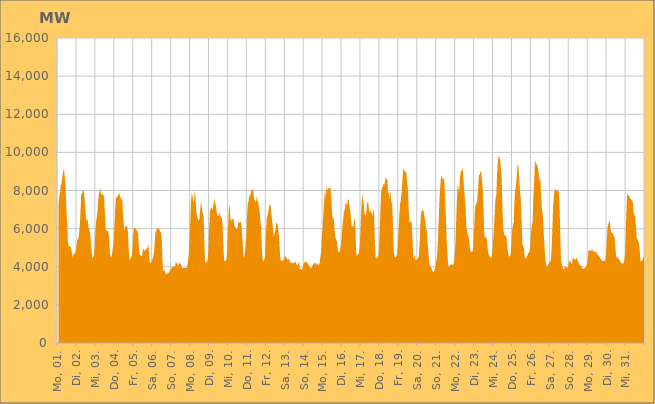
| Category | Series 0 |
|---|---|
|  Mo, 01.  | 7129.859 |
|  Mo, 01.  | 7673.893 |
|  Mo, 01.  | 7833.704 |
|  Mo, 01.  | 8298.259 |
|  Mo, 01.  | 8360.999 |
|  Mo, 01.  | 8725.097 |
|  Mo, 01.  | 8967.838 |
|  Mo, 01.  | 9195.239 |
|  Mo, 01.  | 8722.583 |
|  Mo, 01.  | 8317.963 |
|  Mo, 01.  | 7188.776 |
|  Mo, 01.  | 6366.723 |
|  Mo, 01.  | 5282.318 |
|  Mo, 01.  | 5061.183 |
|  Mo, 01.  | 5069.511 |
|  Mo, 01.  | 5073.156 |
|  Mo, 01.  | 5020.052 |
|  Di, 02.  | 4747.451 |
|  Di, 02.  | 4475.486 |
|  Di, 02.  | 4675.184 |
|  Di, 02.  | 4653.983 |
|  Di, 02.  | 4721.074 |
|  Di, 02.  | 4769.617 |
|  Di, 02.  | 5137.401 |
|  Di, 02.  | 5391.889 |
|  Di, 02.  | 5462.678 |
|  Di, 02.  | 5621.96 |
|  Di, 02.  | 6124.444 |
|  Di, 02.  | 6890.183 |
|  Di, 02.  | 7850.321 |
|  Di, 02.  | 7835.134 |
|  Di, 02.  | 8016.397 |
|  Di, 02.  | 8018.556 |
|  Di, 02.  | 7696.417 |
|  Di, 02.  | 7128.472 |
|  Di, 02.  | 6435.958 |
|  Di, 02.  | 6431.473 |
|  Di, 02.  | 6521.108 |
|  Di, 02.  | 6089.295 |
|  Di, 02.  | 5990.244 |
|  Di, 02.  | 5822.376 |
|  Mi, 03.  | 5435.616 |
|  Mi, 03.  | 4841.119 |
|  Mi, 03.  | 4442.42 |
|  Mi, 03.  | 4523.028 |
|  Mi, 03.  | 4606.582 |
|  Mi, 03.  | 5091.001 |
|  Mi, 03.  | 5968.404 |
|  Mi, 03.  | 6423.607 |
|  Mi, 03.  | 6665.031 |
|  Mi, 03.  | 7119.114 |
|  Mi, 03.  | 7755.533 |
|  Mi, 03.  | 7915.189 |
|  Mi, 03.  | 8147.496 |
|  Mi, 03.  | 7823.214 |
|  Mi, 03.  | 7803.474 |
|  Mi, 03.  | 7806.908 |
|  Mi, 03.  | 7762.133 |
|  Mi, 03.  | 7637.401 |
|  Mi, 03.  | 6734.404 |
|  Mi, 03.  | 5899.255 |
|  Mi, 03.  | 5931.852 |
|  Mi, 03.  | 5849.619 |
|  Mi, 03.  | 5880.683 |
|  Mi, 03.  | 5604.901 |
|  Do, 04.  | 4901.651 |
|  Do, 04.  | 4512.685 |
|  Do, 04.  | 4488.421 |
|  Do, 04.  | 4671.668 |
|  Do, 04.  | 5011.251 |
|  Do, 04.  | 5264.755 |
|  Do, 04.  | 6144.135 |
|  Do, 04.  | 7064.495 |
|  Do, 04.  | 7563.288 |
|  Do, 04.  | 7730.391 |
|  Do, 04.  | 7671.09 |
|  Do, 04.  | 7764.818 |
|  Do, 04.  | 7885.352 |
|  Do, 04.  | 7723.649 |
|  Do, 04.  | 7617.039 |
|  Do, 04.  | 7529.346 |
|  Do, 04.  | 7541.914 |
|  Do, 04.  | 6617.253 |
|  Do, 04.  | 6159.324 |
|  Do, 04.  | 5902.806 |
|  Do, 04.  | 6152.809 |
|  Do, 04.  | 6117.432 |
|  Do, 04.  | 6142.779 |
|  Do, 04.  | 5908.645 |
|  Fr, 05.  | 4958.976 |
|  Fr, 05.  | 4332.08 |
|  Fr, 05.  | 4437.479 |
|  Fr, 05.  | 4452.83 |
|  Fr, 05.  | 4546.803 |
|  Fr, 05.  | 4986.752 |
|  Fr, 05.  | 5748.55 |
|  Fr, 05.  | 6075.568 |
|  Fr, 05.  | 6029.269 |
|  Fr, 05.  | 5981.073 |
|  Fr, 05.  | 5923.186 |
|  Fr, 05.  | 5877.169 |
|  Fr, 05.  | 5766.122 |
|  Fr, 05.  | 5063.674 |
|  Fr, 05.  | 4641.886 |
|  Fr, 05.  | 4590.303 |
|  Fr, 05.  | 4580.817 |
|  Fr, 05.  | 4535.13 |
|  Fr, 05.  | 4870.529 |
|  Fr, 05.  | 4923.622 |
|  Fr, 05.  | 4839.329 |
|  Fr, 05.  | 4844.424 |
|  Fr, 05.  | 4943.589 |
|  Fr, 05.  | 4955.963 |
|  Sa, 06.  | 5003.752 |
|  Sa, 06.  | 5216.602 |
|  Sa, 06.  | 4563.734 |
|  Sa, 06.  | 4200.241 |
|  Sa, 06.  | 4199.412 |
|  Sa, 06.  | 4268.582 |
|  Sa, 06.  | 4367.124 |
|  Sa, 06.  | 4455.75 |
|  Sa, 06.  | 4719.183 |
|  Sa, 06.  | 5167.216 |
|  Sa, 06.  | 5841.41 |
|  Sa, 06.  | 5861.715 |
|  Sa, 06.  | 6106.127 |
|  Sa, 06.  | 5982.405 |
|  Sa, 06.  | 5986.613 |
|  Sa, 06.  | 5950.838 |
|  Sa, 06.  | 5844.445 |
|  Sa, 06.  | 5794.309 |
|  Sa, 06.  | 5493.372 |
|  Sa, 06.  | 4176.971 |
|  Sa, 06.  | 3792.708 |
|  Sa, 06.  | 3808.328 |
|  Sa, 06.  | 3789.137 |
|  Sa, 06.  | 3596.004 |
|  So, 07.  | 3629.062 |
|  So, 07.  | 3640.954 |
|  So, 07.  | 3640.486 |
|  So, 07.  | 3697.788 |
|  So, 07.  | 3803.666 |
|  So, 07.  | 3858.389 |
|  So, 07.  | 3915.168 |
|  So, 07.  | 3962.246 |
|  So, 07.  | 4045.248 |
|  So, 07.  | 3993.991 |
|  So, 07.  | 3987.216 |
|  So, 07.  | 4065.187 |
|  So, 07.  | 4298.033 |
|  So, 07.  | 4164.309 |
|  So, 07.  | 4111.659 |
|  So, 07.  | 4075.323 |
|  So, 07.  | 4203.741 |
|  So, 07.  | 4173.319 |
|  So, 07.  | 4147.988 |
|  So, 07.  | 4018.808 |
|  So, 07.  | 3878.802 |
|  So, 07.  | 3948.895 |
|  So, 07.  | 3943.95 |
|  So, 07.  | 3950.971 |
|  Mo, 08.  | 3946.447 |
|  Mo, 08.  | 3924.24 |
|  Mo, 08.  | 3973.484 |
|  Mo, 08.  | 4163.533 |
|  Mo, 08.  | 4590.058 |
|  Mo, 08.  | 5281.156 |
|  Mo, 08.  | 6276.805 |
|  Mo, 08.  | 7396.469 |
|  Mo, 08.  | 7879.272 |
|  Mo, 08.  | 7730.195 |
|  Mo, 08.  | 7345.812 |
|  Mo, 08.  | 7522.116 |
|  Mo, 08.  | 8073.334 |
|  Mo, 08.  | 7447.185 |
|  Mo, 08.  | 6851.257 |
|  Mo, 08.  | 6645.569 |
|  Mo, 08.  | 6460.086 |
|  Mo, 08.  | 6404.871 |
|  Mo, 08.  | 6544.951 |
|  Mo, 08.  | 7137.67 |
|  Mo, 08.  | 7431.13 |
|  Mo, 08.  | 7018.088 |
|  Mo, 08.  | 6808.462 |
|  Mo, 08.  | 6710.28 |
|  Di, 09.  | 5280.215 |
|  Di, 09.  | 4246.904 |
|  Di, 09.  | 4187.077 |
|  Di, 09.  | 4262.985 |
|  Di, 09.  | 4331.89 |
|  Di, 09.  | 4714.729 |
|  Di, 09.  | 5976.716 |
|  Di, 09.  | 6839.212 |
|  Di, 09.  | 7095.926 |
|  Di, 09.  | 7130.488 |
|  Di, 09.  | 6956.006 |
|  Di, 09.  | 7081.242 |
|  Di, 09.  | 7366.693 |
|  Di, 09.  | 7565.569 |
|  Di, 09.  | 7308.467 |
|  Di, 09.  | 7113.487 |
|  Di, 09.  | 6722.251 |
|  Di, 09.  | 6650.172 |
|  Di, 09.  | 6681.766 |
|  Di, 09.  | 6884.863 |
|  Di, 09.  | 6679.137 |
|  Di, 09.  | 6630.877 |
|  Di, 09.  | 6552.338 |
|  Di, 09.  | 6324.83 |
|  Mi, 10.  | 5182.661 |
|  Mi, 10.  | 4289.572 |
|  Mi, 10.  | 4323.026 |
|  Mi, 10.  | 4317.582 |
|  Mi, 10.  | 4383.706 |
|  Mi, 10.  | 4861.521 |
|  Mi, 10.  | 5951.18 |
|  Mi, 10.  | 7008.456 |
|  Mi, 10.  | 7282.687 |
|  Mi, 10.  | 6602.607 |
|  Mi, 10.  | 6356.122 |
|  Mi, 10.  | 6551.456 |
|  Mi, 10.  | 6454.648 |
|  Mi, 10.  | 6556.919 |
|  Mi, 10.  | 6157.372 |
|  Mi, 10.  | 6114.554 |
|  Mi, 10.  | 6008.775 |
|  Mi, 10.  | 5965.38 |
|  Mi, 10.  | 6006.803 |
|  Mi, 10.  | 6375.733 |
|  Mi, 10.  | 6288.363 |
|  Mi, 10.  | 6331.566 |
|  Mi, 10.  | 6375.968 |
|  Mi, 10.  | 6207.477 |
|  Do, 11.  | 5648.035 |
|  Do, 11.  | 4908.973 |
|  Do, 11.  | 4456.346 |
|  Do, 11.  | 4585.918 |
|  Do, 11.  | 4953.858 |
|  Do, 11.  | 5536.617 |
|  Do, 11.  | 6519.271 |
|  Do, 11.  | 7296.72 |
|  Do, 11.  | 7419.262 |
|  Do, 11.  | 7745.882 |
|  Do, 11.  | 7681.393 |
|  Do, 11.  | 7881.572 |
|  Do, 11.  | 8086.982 |
|  Do, 11.  | 8030.722 |
|  Do, 11.  | 7990.501 |
|  Do, 11.  | 7528.296 |
|  Do, 11.  | 7522.459 |
|  Do, 11.  | 7365.334 |
|  Do, 11.  | 7694.736 |
|  Do, 11.  | 7407.469 |
|  Do, 11.  | 7489.8 |
|  Do, 11.  | 7129.364 |
|  Do, 11.  | 6940.818 |
|  Do, 11.  | 6422.873 |
|  Fr, 12.  | 6068.648 |
|  Fr, 12.  | 4899.062 |
|  Fr, 12.  | 4338.321 |
|  Fr, 12.  | 4322.843 |
|  Fr, 12.  | 4364.444 |
|  Fr, 12.  | 4572.93 |
|  Fr, 12.  | 5697.948 |
|  Fr, 12.  | 6529.31 |
|  Fr, 12.  | 6669.81 |
|  Fr, 12.  | 6827.672 |
|  Fr, 12.  | 7167.786 |
|  Fr, 12.  | 7288.991 |
|  Fr, 12.  | 7189.006 |
|  Fr, 12.  | 6745.478 |
|  Fr, 12.  | 6386.367 |
|  Fr, 12.  | 6012.074 |
|  Fr, 12.  | 5536.491 |
|  Fr, 12.  | 5754.969 |
|  Fr, 12.  | 5910.291 |
|  Fr, 12.  | 6290.893 |
|  Fr, 12.  | 6300.267 |
|  Fr, 12.  | 6182.37 |
|  Fr, 12.  | 5791.17 |
|  Fr, 12.  | 5364.606 |
|  Sa, 13.  | 4555.378 |
|  Sa, 13.  | 4305.204 |
|  Sa, 13.  | 4318.956 |
|  Sa, 13.  | 4329.96 |
|  Sa, 13.  | 4329.789 |
|  Sa, 13.  | 4378.257 |
|  Sa, 13.  | 4569.841 |
|  Sa, 13.  | 4532.606 |
|  Sa, 13.  | 4490.705 |
|  Sa, 13.  | 4338.298 |
|  Sa, 13.  | 4458.808 |
|  Sa, 13.  | 4387.522 |
|  Sa, 13.  | 4298.724 |
|  Sa, 13.  | 4233.941 |
|  Sa, 13.  | 4197.519 |
|  Sa, 13.  | 4197.183 |
|  Sa, 13.  | 4183.812 |
|  Sa, 13.  | 4214.319 |
|  Sa, 13.  | 4199.511 |
|  Sa, 13.  | 4292.816 |
|  Sa, 13.  | 4221.863 |
|  Sa, 13.  | 4132.91 |
|  Sa, 13.  | 4043.977 |
|  Sa, 13.  | 4175.385 |
|  So, 14.  | 4290.427 |
|  So, 14.  | 3881.658 |
|  So, 14.  | 3886.219 |
|  So, 14.  | 3837.966 |
|  So, 14.  | 3853.707 |
|  So, 14.  | 3998.18 |
|  So, 14.  | 4156.772 |
|  So, 14.  | 4240.385 |
|  So, 14.  | 4235.684 |
|  So, 14.  | 4275.376 |
|  So, 14.  | 4254.298 |
|  So, 14.  | 4172.064 |
|  So, 14.  | 4106.668 |
|  So, 14.  | 4001.06 |
|  So, 14.  | 3971.407 |
|  So, 14.  | 3932.226 |
|  So, 14.  | 3931.159 |
|  So, 14.  | 4062.342 |
|  So, 14.  | 4123.111 |
|  So, 14.  | 4159.424 |
|  So, 14.  | 4231.859 |
|  So, 14.  | 4176.742 |
|  So, 14.  | 4109.52 |
|  So, 14.  | 4147.578 |
|  Mo, 15.  | 4184.71 |
|  Mo, 15.  | 4053.094 |
|  Mo, 15.  | 4181.281 |
|  Mo, 15.  | 4477.494 |
|  Mo, 15.  | 4794.329 |
|  Mo, 15.  | 5643.758 |
|  Mo, 15.  | 6164.831 |
|  Mo, 15.  | 6913.736 |
|  Mo, 15.  | 7539.584 |
|  Mo, 15.  | 8070.252 |
|  Mo, 15.  | 7613.511 |
|  Mo, 15.  | 8269.427 |
|  Mo, 15.  | 8011.049 |
|  Mo, 15.  | 8075.093 |
|  Mo, 15.  | 8167.069 |
|  Mo, 15.  | 8159.522 |
|  Mo, 15.  | 8102.785 |
|  Mo, 15.  | 7530.398 |
|  Mo, 15.  | 6782.451 |
|  Mo, 15.  | 6396.16 |
|  Mo, 15.  | 6664.799 |
|  Mo, 15.  | 5929.594 |
|  Mo, 15.  | 5562.304 |
|  Mo, 15.  | 5399.29 |
|  Di, 16.  | 5330.983 |
|  Di, 16.  | 4917.608 |
|  Di, 16.  | 4761.432 |
|  Di, 16.  | 4766.254 |
|  Di, 16.  | 4844.228 |
|  Di, 16.  | 5120.514 |
|  Di, 16.  | 5539.803 |
|  Di, 16.  | 6145.974 |
|  Di, 16.  | 6477.727 |
|  Di, 16.  | 6991.461 |
|  Di, 16.  | 6911.555 |
|  Di, 16.  | 7406.553 |
|  Di, 16.  | 7271.311 |
|  Di, 16.  | 7242.772 |
|  Di, 16.  | 7548.785 |
|  Di, 16.  | 7514.477 |
|  Di, 16.  | 7106.611 |
|  Di, 16.  | 6956.564 |
|  Di, 16.  | 6431.821 |
|  Di, 16.  | 6096.575 |
|  Di, 16.  | 6114.113 |
|  Di, 16.  | 6105.199 |
|  Di, 16.  | 6513.672 |
|  Di, 16.  | 6450.398 |
|  Mi, 17.  | 5180.715 |
|  Mi, 17.  | 4568.967 |
|  Mi, 17.  | 4618.597 |
|  Mi, 17.  | 4674.194 |
|  Mi, 17.  | 4761.251 |
|  Mi, 17.  | 5080.373 |
|  Mi, 17.  | 6019.652 |
|  Mi, 17.  | 7050.354 |
|  Mi, 17.  | 7823.298 |
|  Mi, 17.  | 7492.625 |
|  Mi, 17.  | 7303.765 |
|  Mi, 17.  | 6827.36 |
|  Mi, 17.  | 6624.056 |
|  Mi, 17.  | 6775.874 |
|  Mi, 17.  | 7226.342 |
|  Mi, 17.  | 7450.054 |
|  Mi, 17.  | 7313.738 |
|  Mi, 17.  | 6844.711 |
|  Mi, 17.  | 6874.217 |
|  Mi, 17.  | 7007.441 |
|  Mi, 17.  | 6788.431 |
|  Mi, 17.  | 6690.637 |
|  Mi, 17.  | 7017.383 |
|  Mi, 17.  | 6789.205 |
|  Do, 18.  | 5532.465 |
|  Do, 18.  | 4485.283 |
|  Do, 18.  | 4469.037 |
|  Do, 18.  | 4432.187 |
|  Do, 18.  | 4510.328 |
|  Do, 18.  | 4726.377 |
|  Do, 18.  | 5617.906 |
|  Do, 18.  | 6750.4 |
|  Do, 18.  | 7900.518 |
|  Do, 18.  | 8090.323 |
|  Do, 18.  | 8204.544 |
|  Do, 18.  | 8339.257 |
|  Do, 18.  | 8269.971 |
|  Do, 18.  | 8474.98 |
|  Do, 18.  | 8688.272 |
|  Do, 18.  | 8589.065 |
|  Do, 18.  | 8547.169 |
|  Do, 18.  | 7747.15 |
|  Do, 18.  | 7957.184 |
|  Do, 18.  | 7497.121 |
|  Do, 18.  | 7990.091 |
|  Do, 18.  | 7404.125 |
|  Do, 18.  | 7267.54 |
|  Do, 18.  | 6315.318 |
|  Fr, 19.  | 4837.268 |
|  Fr, 19.  | 4530.626 |
|  Fr, 19.  | 4478.017 |
|  Fr, 19.  | 4510.511 |
|  Fr, 19.  | 4619.046 |
|  Fr, 19.  | 4927.846 |
|  Fr, 19.  | 5830.974 |
|  Fr, 19.  | 6590.092 |
|  Fr, 19.  | 7247.852 |
|  Fr, 19.  | 7505.265 |
|  Fr, 19.  | 7894.741 |
|  Fr, 19.  | 8508.788 |
|  Fr, 19.  | 9059.927 |
|  Fr, 19.  | 9149.289 |
|  Fr, 19.  | 8994.032 |
|  Fr, 19.  | 8981.07 |
|  Fr, 19.  | 8941.727 |
|  Fr, 19.  | 8435.963 |
|  Fr, 19.  | 8033.63 |
|  Fr, 19.  | 7047.817 |
|  Fr, 19.  | 6277.683 |
|  Fr, 19.  | 6345.141 |
|  Fr, 19.  | 6450.015 |
|  Fr, 19.  | 6118.051 |
|  Sa, 20.  | 5260.563 |
|  Sa, 20.  | 4367.314 |
|  Sa, 20.  | 4646.041 |
|  Sa, 20.  | 4432.068 |
|  Sa, 20.  | 4339.76 |
|  Sa, 20.  | 4355.578 |
|  Sa, 20.  | 4430.166 |
|  Sa, 20.  | 4438.147 |
|  Sa, 20.  | 4602.175 |
|  Sa, 20.  | 5421.236 |
|  Sa, 20.  | 6467.972 |
|  Sa, 20.  | 6845.012 |
|  Sa, 20.  | 7009.941 |
|  Sa, 20.  | 6943.42 |
|  Sa, 20.  | 6908.564 |
|  Sa, 20.  | 6638.964 |
|  Sa, 20.  | 6410.491 |
|  Sa, 20.  | 5956.137 |
|  Sa, 20.  | 5938.966 |
|  Sa, 20.  | 5244.27 |
|  Sa, 20.  | 4735.816 |
|  Sa, 20.  | 4164.591 |
|  Sa, 20.  | 4050.603 |
|  Sa, 20.  | 3999.927 |
|  So, 21.  | 3911.274 |
|  So, 21.  | 3777.191 |
|  So, 21.  | 3715.82 |
|  So, 21.  | 3759.277 |
|  So, 21.  | 3846.447 |
|  So, 21.  | 4023.705 |
|  So, 21.  | 4312.669 |
|  So, 21.  | 4551.292 |
|  So, 21.  | 5314.99 |
|  So, 21.  | 6394.38 |
|  So, 21.  | 7507.408 |
|  So, 21.  | 8208.675 |
|  So, 21.  | 8793.341 |
|  So, 21.  | 8673.873 |
|  So, 21.  | 8614.735 |
|  So, 21.  | 8624.143 |
|  So, 21.  | 8590.152 |
|  So, 21.  | 7727.151 |
|  So, 21.  | 6847.132 |
|  So, 21.  | 5467.268 |
|  So, 21.  | 4743.039 |
|  So, 21.  | 4106.784 |
|  So, 21.  | 3986.707 |
|  So, 21.  | 4088.685 |
|  Mo, 22.  | 4107.556 |
|  Mo, 22.  | 4104.205 |
|  Mo, 22.  | 4157.611 |
|  Mo, 22.  | 4046.263 |
|  Mo, 22.  | 4180.202 |
|  Mo, 22.  | 4443.161 |
|  Mo, 22.  | 4992.941 |
|  Mo, 22.  | 6184.888 |
|  Mo, 22.  | 7402.284 |
|  Mo, 22.  | 8283.09 |
|  Mo, 22.  | 8185.723 |
|  Mo, 22.  | 7899.377 |
|  Mo, 22.  | 8661.894 |
|  Mo, 22.  | 9011.321 |
|  Mo, 22.  | 9039.542 |
|  Mo, 22.  | 9232.49 |
|  Mo, 22.  | 8813.412 |
|  Mo, 22.  | 8222.86 |
|  Mo, 22.  | 7678.621 |
|  Mo, 22.  | 7245.686 |
|  Mo, 22.  | 6152.494 |
|  Mo, 22.  | 5842.06 |
|  Mo, 22.  | 5643.136 |
|  Mo, 22.  | 5590.532 |
|  Di, 23.  | 5221.845 |
|  Di, 23.  | 4828.016 |
|  Di, 23.  | 4787.561 |
|  Di, 23.  | 4784.3 |
|  Di, 23.  | 4790.115 |
|  Di, 23.  | 5174.118 |
|  Di, 23.  | 6029.592 |
|  Di, 23.  | 7007.817 |
|  Di, 23.  | 7267.464 |
|  Di, 23.  | 7290.211 |
|  Di, 23.  | 7556.441 |
|  Di, 23.  | 8095.534 |
|  Di, 23.  | 8833.484 |
|  Di, 23.  | 8815.136 |
|  Di, 23.  | 9046.824 |
|  Di, 23.  | 8884.368 |
|  Di, 23.  | 8504.594 |
|  Di, 23.  | 7998.576 |
|  Di, 23.  | 6739.388 |
|  Di, 23.  | 5550.593 |
|  Di, 23.  | 5561.572 |
|  Di, 23.  | 5581.064 |
|  Di, 23.  | 5457.271 |
|  Di, 23.  | 5024.925 |
|  Mi, 24.  | 4671.698 |
|  Mi, 24.  | 4605.125 |
|  Mi, 24.  | 4520.823 |
|  Mi, 24.  | 4465.137 |
|  Mi, 24.  | 4479.631 |
|  Mi, 24.  | 4872.426 |
|  Mi, 24.  | 5422.95 |
|  Mi, 24.  | 6033.25 |
|  Mi, 24.  | 6824.501 |
|  Mi, 24.  | 7622.671 |
|  Mi, 24.  | 7661.779 |
|  Mi, 24.  | 8875.248 |
|  Mi, 24.  | 9454.291 |
|  Mi, 24.  | 9855.169 |
|  Mi, 24.  | 9738.13 |
|  Mi, 24.  | 9543.099 |
|  Mi, 24.  | 9103.041 |
|  Mi, 24.  | 8476.251 |
|  Mi, 24.  | 6895.192 |
|  Mi, 24.  | 5936.913 |
|  Mi, 24.  | 5685.621 |
|  Mi, 24.  | 5628.936 |
|  Mi, 24.  | 5633.28 |
|  Mi, 24.  | 5544.543 |
|  Do, 25.  | 5031.402 |
|  Do, 25.  | 4708.861 |
|  Do, 25.  | 4526.279 |
|  Do, 25.  | 4546.797 |
|  Do, 25.  | 4598.549 |
|  Do, 25.  | 4975.108 |
|  Do, 25.  | 5894.044 |
|  Do, 25.  | 6174.241 |
|  Do, 25.  | 6324.294 |
|  Do, 25.  | 7372.535 |
|  Do, 25.  | 8039.078 |
|  Do, 25.  | 8220.225 |
|  Do, 25.  | 8751.374 |
|  Do, 25.  | 9401.187 |
|  Do, 25.  | 9313.841 |
|  Do, 25.  | 8716.872 |
|  Do, 25.  | 7981.331 |
|  Do, 25.  | 7617.573 |
|  Do, 25.  | 6596.939 |
|  Do, 25.  | 5237.195 |
|  Do, 25.  | 5063.129 |
|  Do, 25.  | 4954.54 |
|  Do, 25.  | 4531.777 |
|  Do, 25.  | 4437.878 |
|  Fr, 26.  | 4452.013 |
|  Fr, 26.  | 4550.029 |
|  Fr, 26.  | 4641.462 |
|  Fr, 26.  | 4734.715 |
|  Fr, 26.  | 4772.9 |
|  Fr, 26.  | 5014.357 |
|  Fr, 26.  | 5805.201 |
|  Fr, 26.  | 6164.145 |
|  Fr, 26.  | 6321.612 |
|  Fr, 26.  | 7580.563 |
|  Fr, 26.  | 8475.6 |
|  Fr, 26.  | 9426.73 |
|  Fr, 26.  | 9548.028 |
|  Fr, 26.  | 9376.804 |
|  Fr, 26.  | 9319.047 |
|  Fr, 26.  | 9133.164 |
|  Fr, 26.  | 8781.505 |
|  Fr, 26.  | 8514.614 |
|  Fr, 26.  | 8588.798 |
|  Fr, 26.  | 7576.367 |
|  Fr, 26.  | 6943.783 |
|  Fr, 26.  | 6745.97 |
|  Fr, 26.  | 5910.821 |
|  Fr, 26.  | 5156.054 |
|  Sa, 27.  | 4528.24 |
|  Sa, 27.  | 4117.867 |
|  Sa, 27.  | 3997.448 |
|  Sa, 27.  | 4044.693 |
|  Sa, 27.  | 4118.652 |
|  Sa, 27.  | 4208.179 |
|  Sa, 27.  | 4297.669 |
|  Sa, 27.  | 4254.669 |
|  Sa, 27.  | 4872.513 |
|  Sa, 27.  | 5872.605 |
|  Sa, 27.  | 7141.687 |
|  Sa, 27.  | 7676.188 |
|  Sa, 27.  | 8114.11 |
|  Sa, 27.  | 8020.84 |
|  Sa, 27.  | 8010.269 |
|  Sa, 27.  | 7975.617 |
|  Sa, 27.  | 7966.594 |
|  Sa, 27.  | 7977.798 |
|  Sa, 27.  | 7417.965 |
|  Sa, 27.  | 5980.498 |
|  Sa, 27.  | 4364.856 |
|  Sa, 27.  | 4133.305 |
|  Sa, 27.  | 4018.43 |
|  Sa, 27.  | 3891.33 |
|  So, 28.  | 3882.783 |
|  So, 28.  | 4003.327 |
|  So, 28.  | 4016.601 |
|  So, 28.  | 3963.967 |
|  So, 28.  | 3918.558 |
|  So, 28.  | 3999.072 |
|  So, 28.  | 4224.106 |
|  So, 28.  | 4309.441 |
|  So, 28.  | 4268.963 |
|  So, 28.  | 4175.081 |
|  So, 28.  | 4150.949 |
|  So, 28.  | 4497.099 |
|  So, 28.  | 4432.31 |
|  So, 28.  | 4385.002 |
|  So, 28.  | 4352.948 |
|  So, 28.  | 4429.938 |
|  So, 28.  | 4464.166 |
|  So, 28.  | 4325.843 |
|  So, 28.  | 4236.627 |
|  So, 28.  | 4141.69 |
|  So, 28.  | 4070.238 |
|  So, 28.  | 4084.762 |
|  So, 28.  | 4015.759 |
|  So, 28.  | 3917.939 |
|  Mo, 29.  | 3877.358 |
|  Mo, 29.  | 3910.33 |
|  Mo, 29.  | 3934.733 |
|  Mo, 29.  | 3945.965 |
|  Mo, 29.  | 4022.932 |
|  Mo, 29.  | 4176.095 |
|  Mo, 29.  | 4485.606 |
|  Mo, 29.  | 4882.459 |
|  Mo, 29.  | 4900.068 |
|  Mo, 29.  | 4815.381 |
|  Mo, 29.  | 4824.276 |
|  Mo, 29.  | 4903.486 |
|  Mo, 29.  | 4892.24 |
|  Mo, 29.  | 4778.665 |
|  Mo, 29.  | 4827.338 |
|  Mo, 29.  | 4788.925 |
|  Mo, 29.  | 4750.84 |
|  Mo, 29.  | 4757.592 |
|  Mo, 29.  | 4651.768 |
|  Mo, 29.  | 4621.986 |
|  Mo, 29.  | 4558.819 |
|  Mo, 29.  | 4507.243 |
|  Mo, 29.  | 4429.481 |
|  Mo, 29.  | 4376.149 |
|  Di, 30.  | 4310.066 |
|  Di, 30.  | 4294.857 |
|  Di, 30.  | 4303.44 |
|  Di, 30.  | 4294.329 |
|  Di, 30.  | 4333.257 |
|  Di, 30.  | 4599.84 |
|  Di, 30.  | 5388.979 |
|  Di, 30.  | 6057.817 |
|  Di, 30.  | 6214.985 |
|  Di, 30.  | 6383.249 |
|  Di, 30.  | 6354.779 |
|  Di, 30.  | 5902.139 |
|  Di, 30.  | 5797.168 |
|  Di, 30.  | 5741.988 |
|  Di, 30.  | 5760.382 |
|  Di, 30.  | 5606.019 |
|  Di, 30.  | 5507.13 |
|  Di, 30.  | 4983.745 |
|  Di, 30.  | 4526.837 |
|  Di, 30.  | 4486.093 |
|  Di, 30.  | 4445.564 |
|  Di, 30.  | 4434.897 |
|  Di, 30.  | 4366.108 |
|  Di, 30.  | 4276.263 |
|  Mi, 31.  | 4205.33 |
|  Mi, 31.  | 4193.653 |
|  Mi, 31.  | 4155.44 |
|  Mi, 31.  | 4171.759 |
|  Mi, 31.  | 4282.909 |
|  Mi, 31.  | 4557.882 |
|  Mi, 31.  | 5561.208 |
|  Mi, 31.  | 7039.359 |
|  Mi, 31.  | 7903.256 |
|  Mi, 31.  | 7789.768 |
|  Mi, 31.  | 7693.911 |
|  Mi, 31.  | 7689.043 |
|  Mi, 31.  | 7564.491 |
|  Mi, 31.  | 7542.486 |
|  Mi, 31.  | 7466.248 |
|  Mi, 31.  | 7433.23 |
|  Mi, 31.  | 6873.774 |
|  Mi, 31.  | 6686.772 |
|  Mi, 31.  | 6702.163 |
|  Mi, 31.  | 6158.924 |
|  Mi, 31.  | 5455.616 |
|  Mi, 31.  | 5442.62 |
|  Mi, 31.  | 5343.842 |
|  Mi, 31.  | 5211.67 |
|  Do, 01.  | 4749.97 |
|  Do, 01.  | 4282.46 |
|  Do, 01.  | 4292.232 |
|  Do, 01.  | 4328.749 |
|  Do, 01.  | 4434.483 |
|  Do, 01.  | 4540.644 |